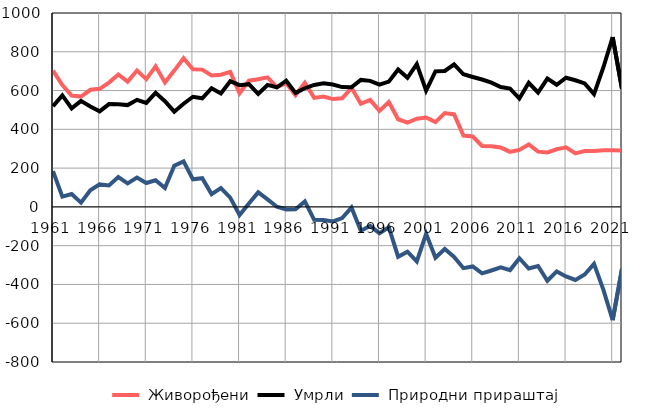
| Category |  Живорођени |  Умрли |  Природни прираштај |
|---|---|---|---|
| 1961.0 | 703 | 519 | 184 |
| 1962.0 | 628 | 575 | 53 |
| 1963.0 | 574 | 508 | 66 |
| 1964.0 | 569 | 547 | 22 |
| 1965.0 | 604 | 518 | 86 |
| 1966.0 | 609 | 493 | 116 |
| 1967.0 | 641 | 530 | 111 |
| 1968.0 | 683 | 529 | 154 |
| 1969.0 | 646 | 525 | 121 |
| 1970.0 | 703 | 552 | 151 |
| 1971.0 | 659 | 536 | 123 |
| 1972.0 | 725 | 588 | 137 |
| 1973.0 | 642 | 545 | 97 |
| 1974.0 | 703 | 491 | 212 |
| 1975.0 | 767 | 532 | 235 |
| 1976.0 | 710 | 568 | 142 |
| 1977.0 | 708 | 560 | 148 |
| 1978.0 | 678 | 612 | 66 |
| 1979.0 | 682 | 585 | 97 |
| 1980.0 | 696 | 648 | 48 |
| 1981.0 | 586 | 628 | -42 |
| 1982.0 | 651 | 633 | 18 |
| 1983.0 | 658 | 583 | 75 |
| 1984.0 | 668 | 629 | 39 |
| 1985.0 | 618 | 617 | 1 |
| 1986.0 | 638 | 651 | -13 |
| 1987.0 | 576 | 588 | -12 |
| 1988.0 | 640 | 612 | 28 |
| 1989.0 | 562 | 629 | -67 |
| 1990.0 | 569 | 637 | -68 |
| 1991.0 | 556 | 631 | -75 |
| 1992.0 | 560 | 618 | -58 |
| 1993.0 | 614 | 617 | -3 |
| 1994.0 | 532 | 655 | -123 |
| 1995.0 | 552 | 650 | -98 |
| 1996.0 | 495 | 631 | -136 |
| 1997.0 | 541 | 646 | -105 |
| 1998.0 | 452 | 709 | -257 |
| 1999.0 | 435 | 666 | -231 |
| 2000.0 | 455 | 736 | -281 |
| 2001.0 | 461 | 600 | -139 |
| 2002.0 | 437 | 699 | -262 |
| 2003.0 | 484 | 701 | -217 |
| 2004.0 | 477 | 735 | -258 |
| 2005.0 | 368 | 684 | -316 |
| 2006.0 | 363 | 670 | -307 |
| 2007.0 | 314 | 657 | -343 |
| 2008.0 | 313 | 641 | -328 |
| 2009.0 | 306 | 618 | -312 |
| 2010.0 | 284 | 610 | -326 |
| 2011.0 | 294 | 559 | -265 |
| 2012.0 | 322 | 640 | -318 |
| 2013.0 | 285 | 590 | -305 |
| 2014.0 | 281 | 662 | -381 |
| 2015.0 | 297 | 630 | -333 |
| 2016.0 | 307 | 666 | -359 |
| 2017.0 | 276 | 653 | -377 |
| 2018.0 | 288 | 637 | -349 |
| 2019.0 | 288 | 582 | -294 |
| 2020.0 | 292 | 719 | -427 |
| 2021.0 | 292 | 876 | -584 |
| 2022.0 | 290 | 609 | -319 |